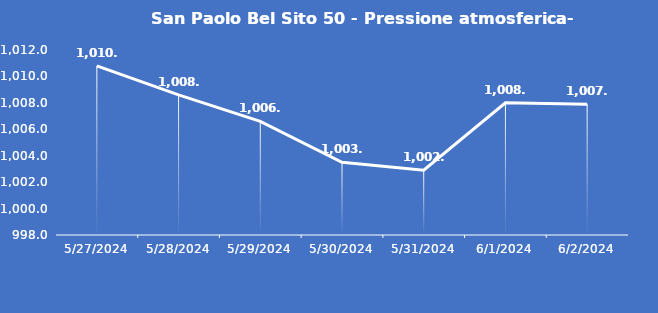
| Category | San Paolo Bel Sito 50 - Pressione atmosferica- Grezzo (hPa) |
|---|---|
| 5/27/24 | 1010.8 |
| 5/28/24 | 1008.6 |
| 5/29/24 | 1006.6 |
| 5/30/24 | 1003.5 |
| 5/31/24 | 1002.9 |
| 6/1/24 | 1008 |
| 6/2/24 | 1007.9 |